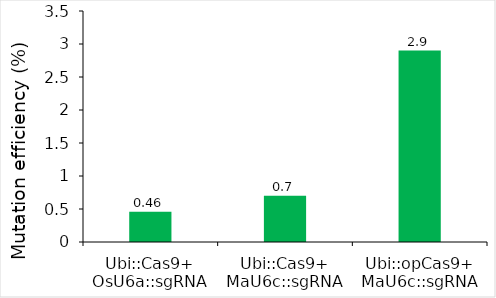
| Category | Series 0 |
|---|---|
| Ubi::Cas9+
OsU6a::sgRNA | 0.46 |
| Ubi::Cas9+
MaU6c::sgRNA | 0.7 |
| Ubi::opCas9+
MaU6c::sgRNA | 2.9 |